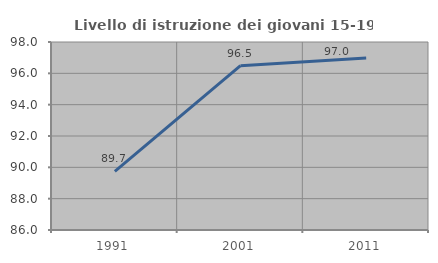
| Category | Livello di istruzione dei giovani 15-19 anni |
|---|---|
| 1991.0 | 89.738 |
| 2001.0 | 96.486 |
| 2011.0 | 96.974 |